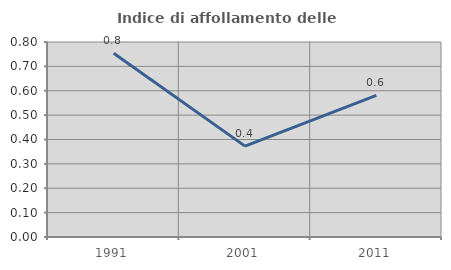
| Category | Indice di affollamento delle abitazioni  |
|---|---|
| 1991.0 | 0.754 |
| 2001.0 | 0.373 |
| 2011.0 | 0.581 |